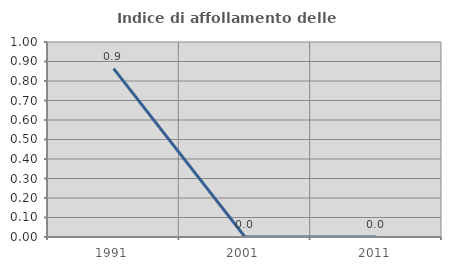
| Category | Indice di affollamento delle abitazioni  |
|---|---|
| 1991.0 | 0.864 |
| 2001.0 | 0 |
| 2011.0 | 0 |